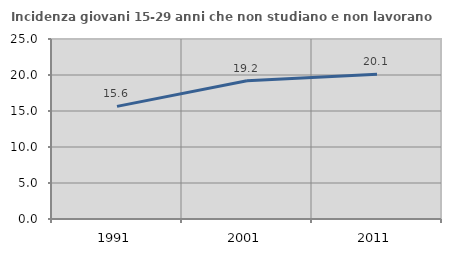
| Category | Incidenza giovani 15-29 anni che non studiano e non lavorano  |
|---|---|
| 1991.0 | 15.641 |
| 2001.0 | 19.192 |
| 2011.0 | 20.099 |